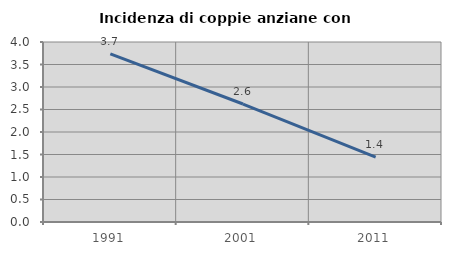
| Category | Incidenza di coppie anziane con figli |
|---|---|
| 1991.0 | 3.734 |
| 2001.0 | 2.622 |
| 2011.0 | 1.444 |